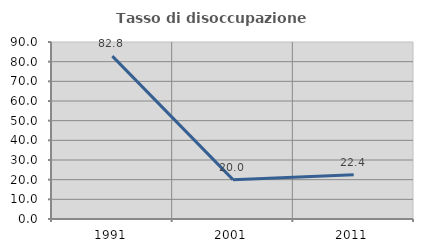
| Category | Tasso di disoccupazione giovanile  |
|---|---|
| 1991.0 | 82.812 |
| 2001.0 | 20 |
| 2011.0 | 22.449 |